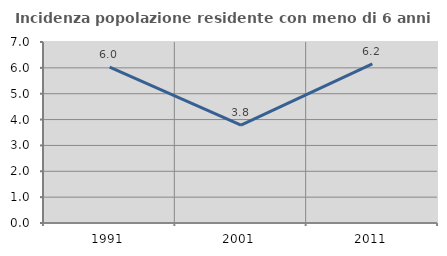
| Category | Incidenza popolazione residente con meno di 6 anni |
|---|---|
| 1991.0 | 6.026 |
| 2001.0 | 3.785 |
| 2011.0 | 6.152 |